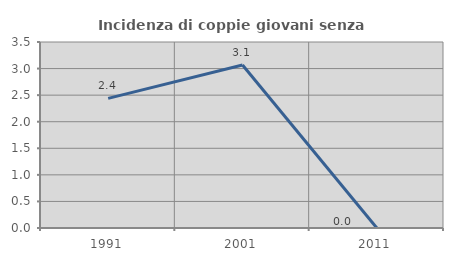
| Category | Incidenza di coppie giovani senza figli |
|---|---|
| 1991.0 | 2.439 |
| 2001.0 | 3.067 |
| 2011.0 | 0 |